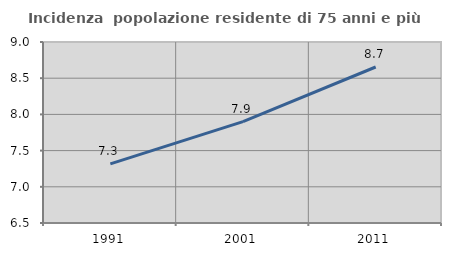
| Category | Incidenza  popolazione residente di 75 anni e più |
|---|---|
| 1991.0 | 7.317 |
| 2001.0 | 7.899 |
| 2011.0 | 8.655 |